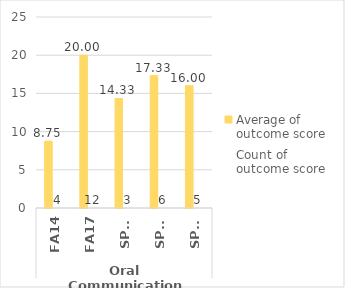
| Category | PTA.AAS - Average of outcome score | PTA.AAS - Count of outcome score |
|---|---|---|
| 0 | 8.75 | 4 |
| 1 | 20 | 12 |
| 2 | 14.333 | 3 |
| 3 | 17.333 | 6 |
| 4 | 16 | 5 |